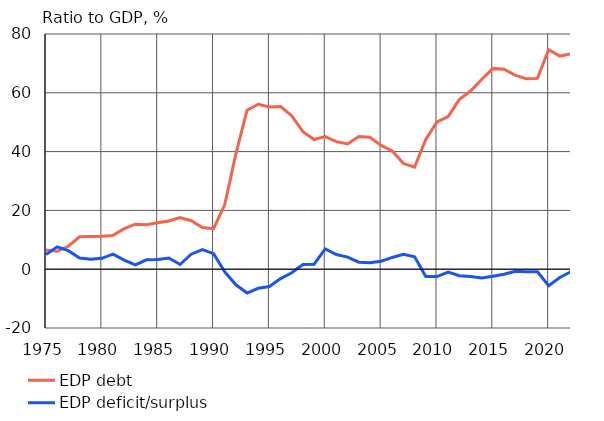
| Category | EDP debt | EDP deficit/surplus |
|---|---|---|
| 1975 | 6.5 | 5 |
| 1976 | 6.1 | 7.6 |
| 1977 | 7.8 | 6.3 |
| 1978 | 11 | 3.8 |
| 1979 | 11.1 | 3.4 |
| 1980 | 11.2 | 3.7 |
| 1981 | 11.5 | 5.1 |
| 1982 | 13.8 | 3.1 |
| 1983 | 15.3 | 1.5 |
| 1984 | 15.1 | 3.2 |
| 1985 | 15.8 | 3.3 |
| 1986 | 16.4 | 3.8 |
| 1987 | 17.6 | 1.6 |
| 1988 | 16.5 | 5.1 |
| 1989 | 14.2 | 6.7 |
| 1990 | 13.8 | 5.3 |
| 1991 | 21.9 | -0.9 |
| 1992 | 39.2 | -5.3 |
| 1993 | 54.1 | -8.1 |
| 1994 | 56.1 | -6.5 |
| 1995 | 55.2 | -5.9 |
| 1996 | 55.3 | -3.2 |
| 1997 | 52.2 | -1.2 |
| 1998 | 46.8 | 1.6 |
| 1999 | 44.1 | 1.7 |
| 2000 | 45.1 | 6.9 |
| 2001 | 43.4 | 5 |
| 2002 | 42.6 | 4.1 |
| 2003 | 45.1 | 2.4 |
| 2004 | 44.9 | 2.2 |
| 2005 | 42.1 | 2.7 |
| 2006 | 40.2 | 4 |
| 2007 | 36 | 5.1 |
| 2008 | 34.7 | 4.2 |
| 2009 | 44.1 | -2.5 |
| 2010 | 50.1 | -2.5 |
| 2011 | 51.9 | -1 |
| 2012 | 57.7 | -2.2 |
| 2013 | 60.6 | -2.5 |
| 2014 | 64.5 | -3 |
| 2015 | 68.3 | -2.4 |
| 2016 | 68 | -1.7 |
| 2017 | 66 | -0.7 |
| 2018 | 64.8 | -0.9 |
| 2019 | 64.9 | -0.9 |
| 2020 | 74.7 | -5.6 |
| 2021* | 72.5 | -2.8 |
| 2022* | 73.3 | -0.8 |